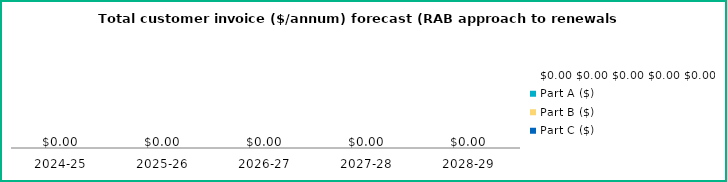
| Category | Part D ($) | Part C ($) | Part B ($) | Part A ($) | Label (RAB) | $0.00 |
|---|---|---|---|---|---|---|
| 2024-25 | 0 | 0 | 0 | 0 |  | 0 |
| 2025-26 | 0 | 0 | 0 | 0 |  | 0 |
| 2026-27 | 0 | 0 | 0 | 0 |  | 0 |
| 2027-28 | 0 | 0 | 0 | 0 |  | 0 |
| 2028-29 | 0 | 0 | 0 | 0 |  | 0 |